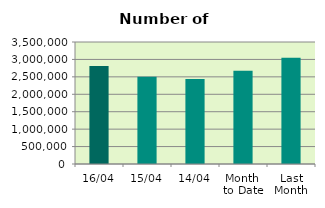
| Category | Series 0 |
|---|---|
| 16/04 | 2809124 |
| 15/04 | 2506604 |
| 14/04 | 2437486 |
| Month 
to Date | 2673895 |
| Last
Month | 3050763.217 |